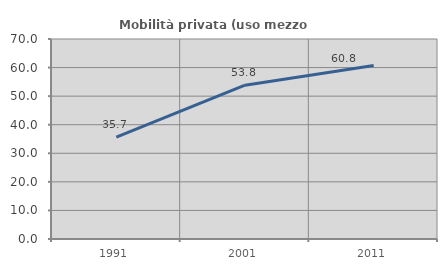
| Category | Mobilità privata (uso mezzo privato) |
|---|---|
| 1991.0 | 35.676 |
| 2001.0 | 53.823 |
| 2011.0 | 60.759 |